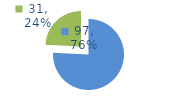
| Category | Series 0 |
|---|---|
| 0 | 97 |
| 1 | 31 |